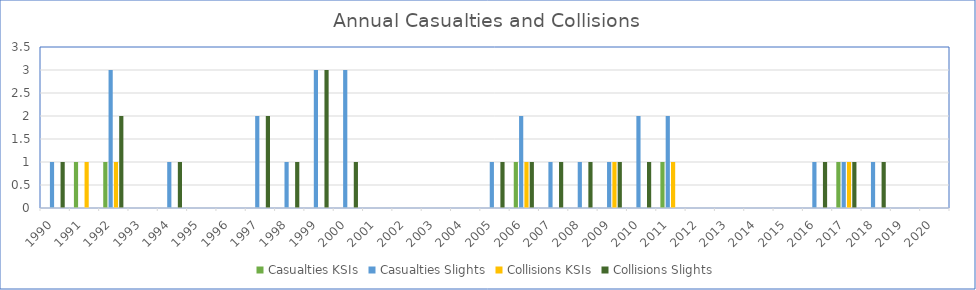
| Category | Casualties | Collisions |
|---|---|---|
| 1990.0 | 1 | 1 |
| 1991.0 | 0 | 0 |
| 1992.0 | 3 | 2 |
| 1993.0 | 0 | 0 |
| 1994.0 | 1 | 1 |
| 1995.0 | 0 | 0 |
| 1996.0 | 0 | 0 |
| 1997.0 | 2 | 2 |
| 1998.0 | 1 | 1 |
| 1999.0 | 3 | 3 |
| 2000.0 | 3 | 1 |
| 2001.0 | 0 | 0 |
| 2002.0 | 0 | 0 |
| 2003.0 | 0 | 0 |
| 2004.0 | 0 | 0 |
| 2005.0 | 1 | 1 |
| 2006.0 | 2 | 1 |
| 2007.0 | 1 | 1 |
| 2008.0 | 1 | 1 |
| 2009.0 | 1 | 1 |
| 2010.0 | 2 | 1 |
| 2011.0 | 2 | 0 |
| 2012.0 | 0 | 0 |
| 2013.0 | 0 | 0 |
| 2014.0 | 0 | 0 |
| 2015.0 | 0 | 0 |
| 2016.0 | 1 | 1 |
| 2017.0 | 1 | 1 |
| 2018.0 | 1 | 1 |
| 2019.0 | 0 | 0 |
| 2020.0 | 0 | 0 |